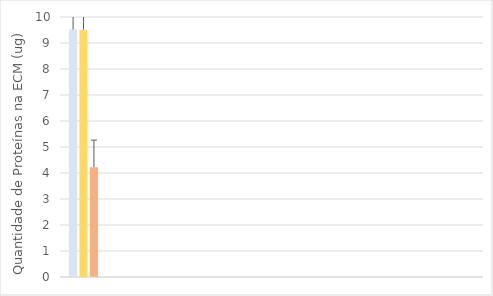
| Category | wt | ∆efg1 | ∆tec1 |
|---|---|---|---|
|  | 9.514 | 9.514 | 4.221 |